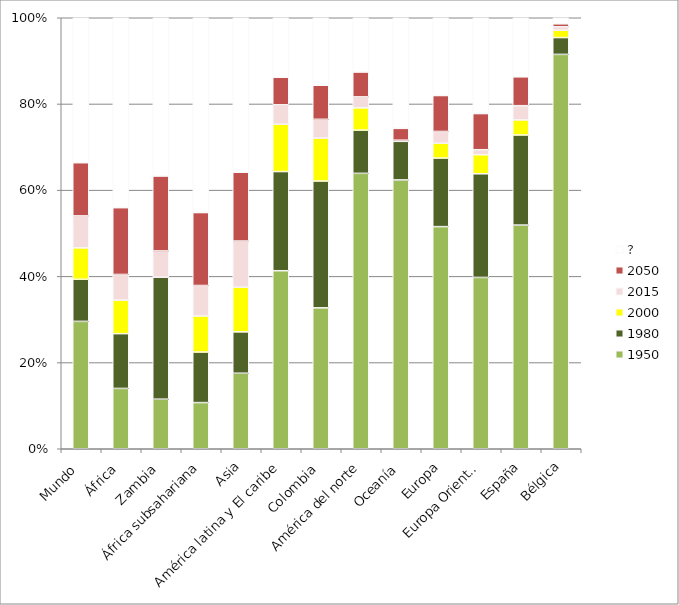
| Category | 1950 | 1980 | 2000 | 2015 | 2050 | ? |
|---|---|---|---|---|---|---|
| Mundo | 29.555 | 9.769 | 7.286 | 7.416 | 12.34 | 33.634 |
| África | 13.999 | 12.706 | 7.783 | 5.95 | 15.495 | 44.067 |
| Zambia | 11.5 | 28.3 | 0 | 6.1 | 17.4 | 36.7 |
| África subsahariana | 10.712 | 11.725 | 8.373 | 7.068 | 16.923 | 45.199 |
| Asia | 17.523 | 9.597 | 10.346 | 10.726 | 15.971 | 35.837 |
| América latina y El caribe | 41.303 | 23.01 | 10.985 | 4.499 | 6.393 | 13.81 |
| Colombia | 32.7 | 29.421 | 9.954 | 4.361 | 7.901 | 15.663 |
| América del norte | 63.903 | 10.027 | 5.173 | 2.54 | 5.778 | 12.58 |
| Oceanía | 62.375 | 8.956 | 0 | 0.262 | 2.743 | 25.664 |
| Europa | 51.538 | 15.91 | 3.438 | 2.732 | 8.337 | 18.045 |
| Europa Oriental | 39.745 | 24.054 | 4.415 | 1.17 | 8.383 | 22.233 |
| España | 51.9 | 20.9 | 3.5 | 3.3 | 6.7 | 13.7 |
| Bélgica | 91.5 | 3.9 | 1.7 | 0.8 | 0.7 | 1.4 |